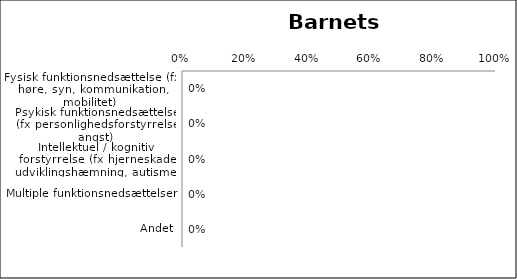
| Category | Funktionsnedsættelse |
|---|---|
| Fysisk funktionsnedsættelse (fx høre, syn, kommunikation, mobilitet) | 0 |
| Psykisk funktionsnedsættelse (fx personlighedsforstyrrelse, angst) | 0 |
| Intellektuel / kognitiv forstyrrelse (fx hjerneskade, udviklingshæmning, autisme, ADHD) | 0 |
| Multiple funktionsnedsættelser | 0 |
| Andet | 0 |